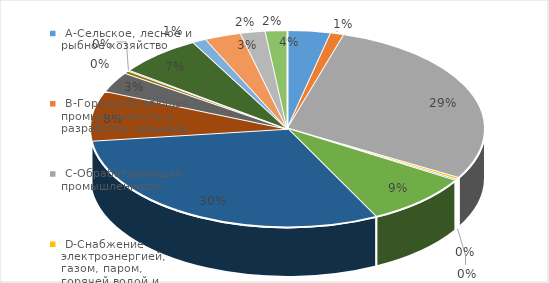
| Category | Series 0 |
|---|---|
|  A-Сельское, лесное и рыбное хозяйство   | 0.036 |
|  B-Горнодобывающая промышленность и разработка карьеров  | 0.011 |
|  C-Обрабатывающая промышленность  | 0.287 |
|  D-Снабжение электроэнергией, газом, паром, горячей водой и  кондиционированным воздухом  | 0.003 |
|  E-Водоснабжение; сбор, обработка и удаление отходов, деятельность по ликвидации загрязнений  | 0.002 |
|  F-Строительство  | 0.088 |
|  G-Оптовая и розничная торговля; ремонт автомобилей и мотоциклов  | 0.305 |
|  H-Транспорт и складирование  | 0.082 |
|  I-Услуги по проживанию и питанию  | 0.034 |
| J-Информация и связь | 0.005 |
| K-Финансовая и страховая деятельность | 0.001 |
| L-Операции с недвижимым имуществом | 0.069 |
| M-Профессиональная, научная и техническая деятельность | 0.011 |
| N-Деятельность в области административного и вспомогательного обслуживания | 0.03 |
| P-Образование | 0.02 |
| S-Предоставление прочих видов услуг | 0.018 |